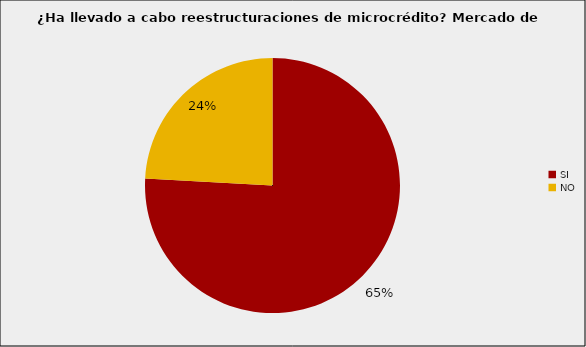
| Category | Mercado de Microcrédito |
|---|---|
| SI | 0.759 |
| NO | 0.241 |